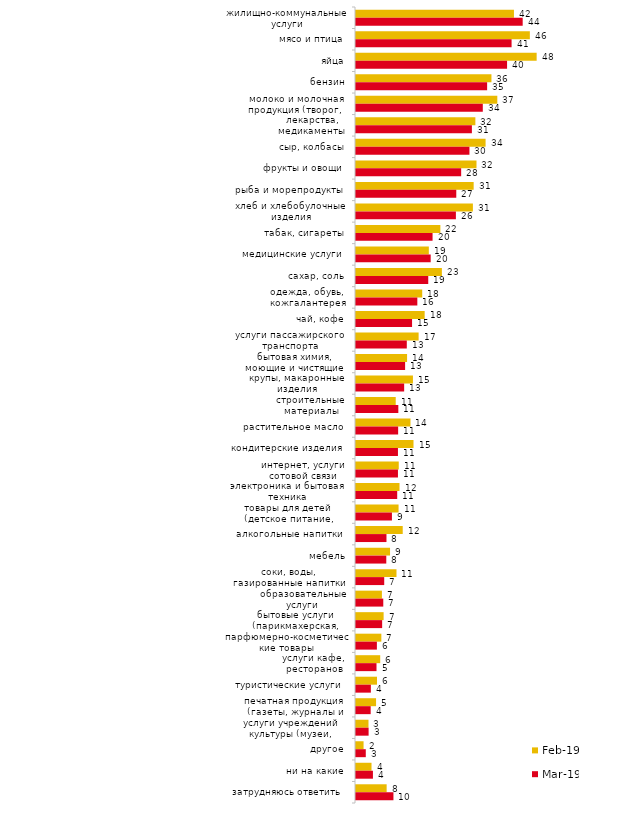
| Category | фев.19 | мар.19 |
|---|---|---|
| жилищно-коммунальные услуги | 41.75 | 44.058 |
| мясо и птица | 45.95 | 41.124 |
| яйца | 47.75 | 39.93 |
| бензин | 35.8 | 34.659 |
| молоко и молочная продукция (творог, кефир, масло и т.д.) | 37.35 | 33.516 |
| лекарства, медикаменты | 31.55 | 30.632 |
| сыр, колбасы | 34.25 | 29.985 |
| фрукты и овощи | 31.85 | 27.797 |
| рыба и морепродукты | 31.1 | 26.504 |
| хлеб и хлебобулочные изделия | 30.9 | 26.405 |
| табак, сигареты | 22.3 | 20.239 |
| медицинские услуги | 19.25 | 19.741 |
| сахар, соль | 22.7 | 19.095 |
| одежда, обувь, кожгалантерея | 17.5 | 16.211 |
| чай, кофе | 18.15 | 14.818 |
| услуги пассажирского транспорта | 16.55 | 13.426 |
| бытовая химия, моющие и чистящие средства | 13.5 | 12.979 |
| крупы, макаронные изделия | 15.05 | 12.73 |
| строительные материалы | 10.5 | 11.188 |
| растительное масло | 14.4 | 11.139 |
| кондитерские изделия | 15.2 | 11.089 |
| интернет, услуги сотовой связи | 11.3 | 11.089 |
| электроника и бытовая техника | 11.5 | 10.89 |
| товары для детей (детское питание, подгузники, игрушки и т.п.) | 11.25 | 9.498 |
| алкогольные напитки | 12.35 | 8.056 |
| мебель | 9 | 8.006 |
| соки, воды, газированные напитки | 10.7 | 7.459 |
| образовательные услуги | 6.85 | 7.21 |
| бытовые услуги (парикмахерская, химчистка, ателье и т.д.) | 7.3 | 6.912 |
| парфюмерно-косметические товары | 6.7 | 5.52 |
| услуги кафе, ресторанов | 6.4 | 5.42 |
| туристические услуги | 5.55 | 3.928 |
| печатная продукция (газеты, журналы и т.п.) | 5.3 | 3.879 |
| услуги учреждений культуры (музеи, театры, кинотеатры и т.п.) | 3.3 | 3.332 |
| другое | 2 | 2.586 |
| ни на какие | 4.1 | 4.475 |
| затрудняюсь ответить | 8.1 | 9.896 |